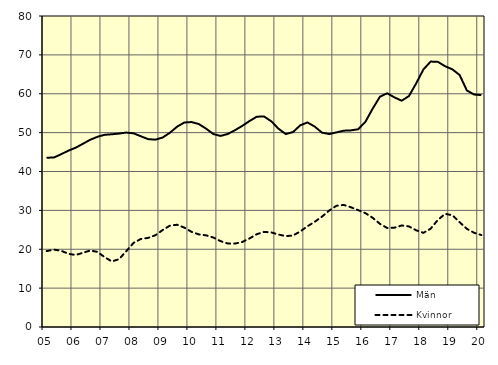
| Category | Män | Kvinnor |
|---|---|---|
| 5.0 | 43.55 | 19.52 |
| nan | 43.59 | 19.9 |
| 6.0 | 44.44 | 19.62 |
| 6.0 | 45.36 | 18.83 |
| 6.0 | 46.11 | 18.53 |
| nan | 47.12 | 19.07 |
| 7.0 | 48.15 | 19.67 |
| 7.0 | 48.92 | 19.34 |
| 7.0 | 49.44 | 17.97 |
| nan | 49.58 | 16.87 |
| 8.0 | 49.76 | 17.45 |
| 8.0 | 50.02 | 19.52 |
| 8.0 | 49.81 | 21.64 |
| nan | 49.07 | 22.64 |
| 9.0 | 48.33 | 22.92 |
| 9.0 | 48.19 | 23.6 |
| 9.0 | 48.73 | 24.92 |
| nan | 49.95 | 26.06 |
| 10.0 | 51.52 | 26.3 |
| 10.0 | 52.6 | 25.57 |
| 10.0 | 52.72 | 24.48 |
| nan | 52.21 | 23.82 |
| 11.0 | 51.03 | 23.58 |
| 11.0 | 49.64 | 23.03 |
| 11.0 | 49.15 | 22.1 |
| nan | 49.65 | 21.47 |
| 12.0 | 50.63 | 21.46 |
| 12.0 | 51.73 | 21.87 |
| 12.0 | 52.98 | 22.78 |
| nan | 54.1 | 23.87 |
| 13.0 | 54.15 | 24.47 |
| 13.0 | 52.93 | 24.33 |
| 13.0 | 51.01 | 23.78 |
| nan | 49.63 | 23.38 |
| 14.0 | 50.14 | 23.53 |
| 14.0 | 51.87 | 24.58 |
| 14.0 | 52.62 | 25.91 |
| nan | 51.55 | 27.06 |
| 15.0 | 50 | 28.39 |
| 15.0 | 49.63 | 29.95 |
| 15.0 | 50.06 | 31.19 |
| nan | 50.5 | 31.4 |
| 16.0 | 50.58 | 30.8 |
| 16.0 | 50.87 | 30.06 |
| 16.0 | 52.8 | 29.29 |
| nan | 56.18 | 28.08 |
| 17.0 | 59.24 | 26.54 |
| 17.0 | 60.12 | 25.47 |
| 17.0 | 59.07 | 25.55 |
| nan | 58.21 | 26.12 |
| 18.0 | 59.4 | 25.87 |
| 18.0 | 62.66 | 24.88 |
| 18.0 | 66.25 | 24.22 |
| nan | 68.28 | 25.29 |
| 19.0 | 68.2 | 27.56 |
| 19.0 | 67.08 | 29.11 |
| 19.0 | 66.28 | 28.74 |
| nan | 64.81 | 26.95 |
| 20.0 | 60.84 | 25.25 |
| 20.0 | 59.8 | 24.23 |
| 20.0 | 59.65 | 23.65 |